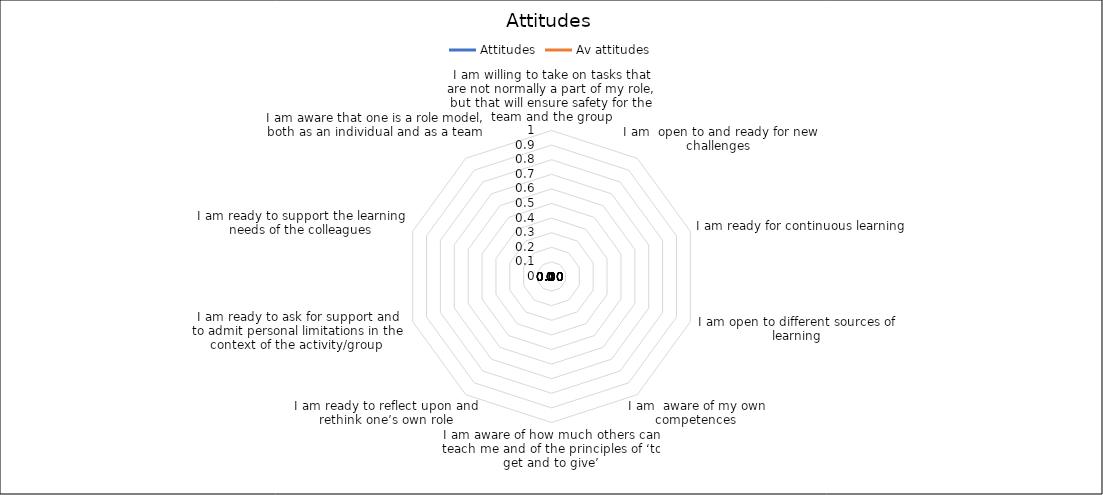
| Category | Attitudes | Av attitudes |
|---|---|---|
| I am willing to take on tasks that are not normally a part of my role, but that will ensure safety for the team and the group | 0 | 0 |
| I am  open to and ready for new challenges  | 0 | 0 |
| I am ready for continuous learning  | 0 | 0 |
| I am open to different sources of learning | 0 | 0 |
| I am  aware of my own competences  | 0 | 0 |
| I am aware of how much others can teach me and of the principles of ‘to get and to give’ | 0 | 0 |
| I am ready to reflect upon and rethink one’s own role | 0 | 0 |
| I am ready to ask for support and to admit personal limitations in the context of the activity/group  | 0 | 0 |
| I am ready to support the learning needs of the colleagues | 0 | 0 |
| I am aware that one is a role model, both as an individual and as a team | 0 | 0 |